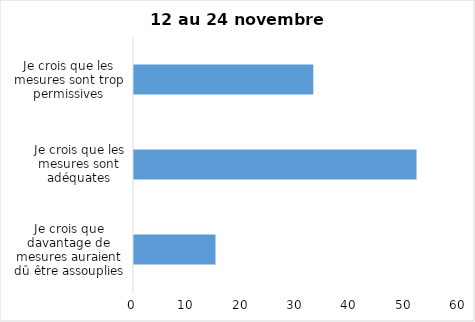
| Category | Series 0 |
|---|---|
| Je crois que davantage de mesures auraient dû être assouplies | 15 |
| Je crois que les mesures sont adéquates | 52 |
| Je crois que les mesures sont trop permissives | 33 |